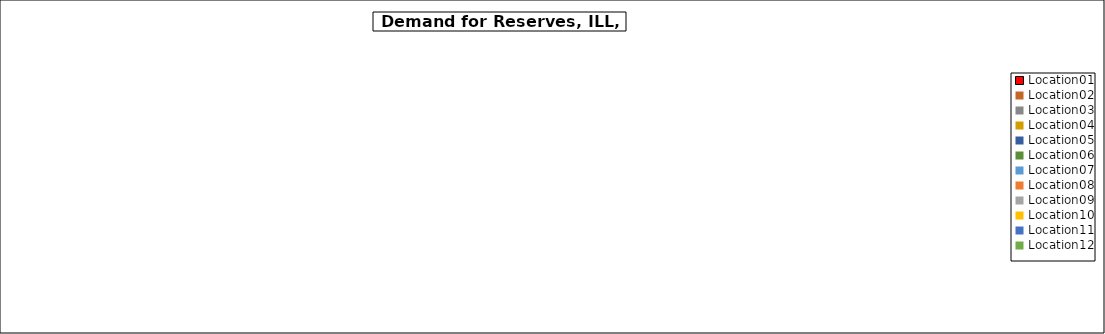
| Category | Data A |
|---|---|
| Location01 | 0 |
| Location02 | 0 |
| Location03 | 0 |
| Location04 | 0 |
| Location05 | 0 |
| Location06 | 0 |
| Location07 | 0 |
| Location08 | 0 |
| Location09 | 0 |
| Location10 | 0 |
| Location11 | 0 |
| Location12 | 0 |